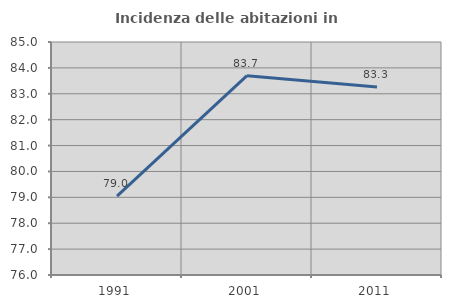
| Category | Incidenza delle abitazioni in proprietà  |
|---|---|
| 1991.0 | 79.043 |
| 2001.0 | 83.7 |
| 2011.0 | 83.265 |